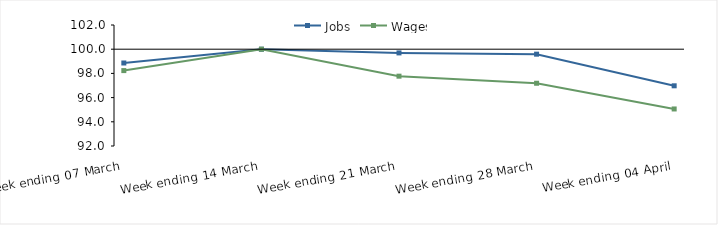
| Category | Jobs | Wages |
|---|---|---|
| 0 | 98.86 | 98.232 |
| 1900-01-01 | 100 | 100 |
| 1900-01-02 | 99.693 | 97.77 |
| 1900-01-03 | 99.589 | 97.186 |
| 1900-01-04 | 96.975 | 95.061 |